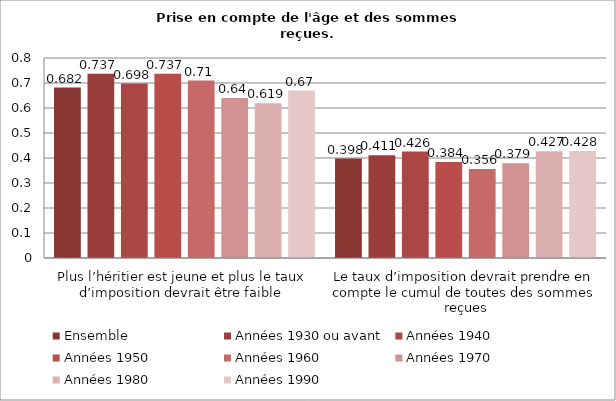
| Category | Ensemble | Années 1930 ou avant | Années 1940 | Années 1950 | Années 1960 | Années 1970 | Années 1980 | Années 1990 |
|---|---|---|---|---|---|---|---|---|
| Plus l’héritier est jeune et plus le taux d’imposition devrait être faible  | 0.682 | 0.737 | 0.698 | 0.737 | 0.71 | 0.64 | 0.619 | 0.67 |
| Le taux d’imposition devrait prendre en compte le cumul de toutes des sommes reçues | 0.398 | 0.411 | 0.426 | 0.384 | 0.356 | 0.379 | 0.427 | 0.428 |